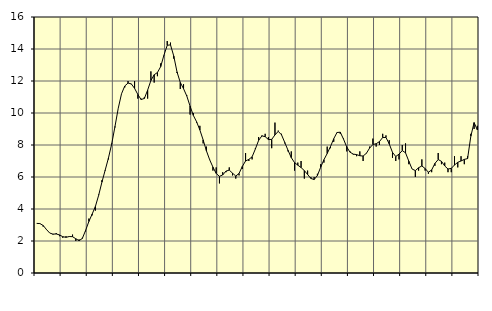
| Category | Piggar | Series 1 |
|---|---|---|
| nan | 3.1 | 3.1 |
| 87.0 | 3.1 | 3.09 |
| 87.0 | 2.9 | 2.97 |
| 87.0 | 2.7 | 2.72 |
| nan | 2.5 | 2.5 |
| 88.0 | 2.4 | 2.43 |
| 88.0 | 2.5 | 2.44 |
| 88.0 | 2.3 | 2.38 |
| nan | 2.2 | 2.27 |
| 89.0 | 2.3 | 2.23 |
| 89.0 | 2.3 | 2.28 |
| 89.0 | 2.4 | 2.27 |
| nan | 2 | 2.14 |
| 90.0 | 2.1 | 2.02 |
| 90.0 | 2.2 | 2.16 |
| 90.0 | 2.6 | 2.66 |
| nan | 3.4 | 3.22 |
| 91.0 | 3.6 | 3.68 |
| 91.0 | 3.9 | 4.16 |
| 91.0 | 4.9 | 4.86 |
| nan | 5.8 | 5.68 |
| 92.0 | 6.4 | 6.43 |
| 92.0 | 7.1 | 7.19 |
| 92.0 | 8.1 | 8.07 |
| nan | 9.1 | 9.16 |
| 93.0 | 10.3 | 10.3 |
| 93.0 | 11.2 | 11.2 |
| 93.0 | 11.6 | 11.69 |
| nan | 12 | 11.87 |
| 94.0 | 11.8 | 11.82 |
| 94.0 | 12 | 11.54 |
| 94.0 | 10.9 | 11.16 |
| nan | 10.9 | 10.84 |
| 95.0 | 11 | 10.91 |
| 95.0 | 10.9 | 11.43 |
| 95.0 | 12.6 | 12.03 |
| nan | 11.9 | 12.39 |
| 96.0 | 12.3 | 12.53 |
| 96.0 | 13.1 | 12.9 |
| 96.0 | 13.6 | 13.62 |
| nan | 14.5 | 14.23 |
| 97.0 | 14.4 | 14.26 |
| 97.0 | 13.4 | 13.56 |
| 97.0 | 12.5 | 12.57 |
| nan | 11.5 | 11.91 |
| 98.0 | 11.8 | 11.52 |
| 98.0 | 11.1 | 11.06 |
| 98.0 | 9.9 | 10.43 |
| nan | 10 | 9.85 |
| 99.0 | 9.4 | 9.45 |
| 99.0 | 9.2 | 8.94 |
| 99.0 | 8.1 | 8.32 |
| nan | 7.9 | 7.64 |
| 0.0 | 7.1 | 7.08 |
| 0.0 | 6.4 | 6.62 |
| 0.0 | 6.6 | 6.22 |
| nan | 5.6 | 6.04 |
| 1.0 | 6.3 | 6.13 |
| 1.0 | 6.3 | 6.37 |
| 1.0 | 6.6 | 6.43 |
| nan | 6.1 | 6.24 |
| 2.0 | 5.9 | 6.06 |
| 2.0 | 6.1 | 6.22 |
| 2.0 | 6.5 | 6.66 |
| nan | 7.5 | 7 |
| 3.0 | 7 | 7.1 |
| 3.0 | 7.1 | 7.26 |
| 3.0 | 7.8 | 7.75 |
| nan | 8.5 | 8.29 |
| 4.0 | 8.6 | 8.57 |
| 4.0 | 8.7 | 8.52 |
| 4.0 | 8.5 | 8.34 |
| nan | 7.8 | 8.35 |
| 5.0 | 9.4 | 8.63 |
| 5.0 | 8.9 | 8.85 |
| 5.0 | 8.7 | 8.64 |
| nan | 8.1 | 8.16 |
| 6.0 | 7.6 | 7.67 |
| 6.0 | 7.6 | 7.21 |
| 6.0 | 6.4 | 6.9 |
| nan | 6.9 | 6.74 |
| 7.0 | 7 | 6.59 |
| 7.0 | 5.9 | 6.4 |
| 7.0 | 6.4 | 6.16 |
| nan | 6 | 5.91 |
| 8.0 | 6 | 5.84 |
| 8.0 | 6.2 | 6.09 |
| 8.0 | 6.8 | 6.61 |
| nan | 6.9 | 7.08 |
| 9.0 | 7.9 | 7.47 |
| 9.0 | 7.8 | 7.9 |
| 9.0 | 8.2 | 8.39 |
| nan | 8.8 | 8.78 |
| 10.0 | 8.7 | 8.8 |
| 10.0 | 8.4 | 8.37 |
| 10.0 | 7.6 | 7.87 |
| nan | 7.6 | 7.55 |
| 11.0 | 7.4 | 7.43 |
| 11.0 | 7.3 | 7.4 |
| 11.0 | 7.6 | 7.33 |
| nan | 7 | 7.31 |
| 12.0 | 7.5 | 7.48 |
| 12.0 | 7.9 | 7.81 |
| 12.0 | 8.4 | 8.03 |
| nan | 7.9 | 8.08 |
| 13.0 | 8 | 8.21 |
| 13.0 | 8.7 | 8.47 |
| 13.0 | 8.6 | 8.47 |
| nan | 8.3 | 8.07 |
| 14.0 | 7.2 | 7.54 |
| 14.0 | 7 | 7.28 |
| 14.0 | 7.1 | 7.43 |
| nan | 8 | 7.65 |
| 15.0 | 8.1 | 7.51 |
| 15.0 | 6.8 | 6.99 |
| 15.0 | 6.5 | 6.5 |
| nan | 6 | 6.4 |
| 16.0 | 6.4 | 6.58 |
| 16.0 | 7.1 | 6.69 |
| 16.0 | 6.4 | 6.53 |
| nan | 6.2 | 6.3 |
| 17.0 | 6.3 | 6.44 |
| 17.0 | 6.7 | 6.85 |
| 17.0 | 7.5 | 7.09 |
| nan | 6.8 | 6.98 |
| 18.0 | 6.9 | 6.69 |
| 18.0 | 6.3 | 6.5 |
| 18.0 | 6.3 | 6.54 |
| nan | 7.3 | 6.75 |
| 19.0 | 6.6 | 6.92 |
| 19.0 | 7.3 | 7 |
| 19.0 | 6.8 | 7.1 |
| nan | 7.3 | 7.15 |
| 20.0 | 8.7 | 8.55 |
| 20.0 | 9 | 9.4 |
| 20.0 | 9.2 | 8.94 |